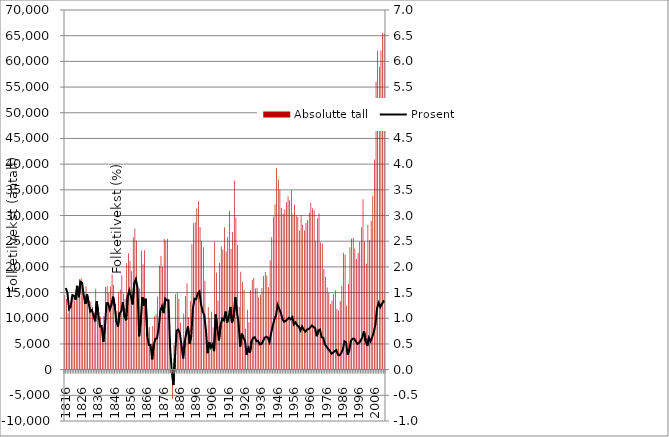
| Category | Absolutte tall |
|---|---|
| 1816 | 14492 |
| 1817 | 13813 |
| 1818 | 11086 |
| 1819 | 11678 |
| 1820 | 13969 |
| 1821 | 14039 |
| 1822 | 13448 |
| 1823 | 16417 |
| 1824 | 14407 |
| 1825 | 17655 |
| 1826 | 17784 |
| 1827 | 15534 |
| 1828 | 13937 |
| 1829 | 16211 |
| 1830 | 14534 |
| 1831 | 12834 |
| 1832 | 13257 |
| 1833 | 12173 |
| 1834 | 10995 |
| 1835 | 15741 |
| 1836 | 12808 |
| 1837 | 10199 |
| 1838 | 10312 |
| 1839 | 6605 |
| 1840 | 10431 |
| 1841 | 16099 |
| 1842 | 16285 |
| 1843 | 14907 |
| 1844 | 16252 |
| 1845 | 18573 |
| 1846 | 16513 |
| 1847 | 12694 |
| 1848 | 11411 |
| 1849 | 15060 |
| 1850 | 15584 |
| 1851 | 18340 |
| 1852 | 14797 |
| 1853 | 13771 |
| 1854 | 20757 |
| 1855 | 22649 |
| 1856 | 21128 |
| 1857 | 19137 |
| 1858 | 25764 |
| 1859 | 27449 |
| 1860 | 25128 |
| 1861 | 10449 |
| 1862 | 15767 |
| 1863 | 23128 |
| 1864 | 20513 |
| 1865 | 23246 |
| 1866 | 11031 |
| 1867 | 8146 |
| 1868 | 8309 |
| 1869 | 3413 |
| 1870 | 8507 |
| 1871 | 10382 |
| 1872 | 10769 |
| 1873 | 14215 |
| 1874 | 20224 |
| 1875 | 22101 |
| 1876 | 20005 |
| 1877 | 25427 |
| 1878 | 25100 |
| 1879 | 25482 |
| 1880 | 8416 |
| 1881 | -670 |
| 1882 | -5692 |
| 1883 | 4791 |
| 1884 | 14692 |
| 1885 | 15025 |
| 1886 | 13788 |
| 1887 | 9179 |
| 1888 | 4438 |
| 1889 | 10922 |
| 1890 | 14346 |
| 1891 | 16803 |
| 1892 | 10222 |
| 1893 | 13339 |
| 1894 | 24382 |
| 1895 | 28480 |
| 1896 | 28696 |
| 1897 | 31394 |
| 1898 | 32778 |
| 1899 | 27775 |
| 1900 | 25024 |
| 1901 | 23832 |
| 1902 | 17316 |
| 1903 | 7249 |
| 1904 | 12203 |
| 1905 | 9954 |
| 1906 | 11283 |
| 1907 | 8260 |
| 1908 | 24944 |
| 1909 | 18916 |
| 1910 | 13450 |
| 1911 | 20788 |
| 1912 | 23988 |
| 1913 | 23391 |
| 1914 | 27700 |
| 1915 | 22994 |
| 1916 | 25829 |
| 1917 | 30902 |
| 1918 | 23469 |
| 1919 | 26811 |
| 1920 | 36780 |
| 1921 | 29626 |
| 1922 | 24320 |
| 1923 | 12233 |
| 1924 | 19065 |
| 1925 | 17033 |
| 1926 | 15549 |
| 1927 | 7971 |
| 1928 | 11646 |
| 1929 | 9216 |
| 1930 | 15451 |
| 1931 | 17435 |
| 1932 | 17858 |
| 1933 | 15772 |
| 1934 | 15953 |
| 1935 | 14057 |
| 1936 | 14559 |
| 1937 | 15888 |
| 1938 | 18234 |
| 1939 | 18989 |
| 1940 | 18315 |
| 1941 | 16020 |
| 1942 | 21277 |
| 1943 | 25816 |
| 1944 | 29747 |
| 1945 | 32185 |
| 1946 | 39228 |
| 1947 | 37028 |
| 1948 | 34974 |
| 1949 | 31455 |
| 1950 | 30342 |
| 1951 | 31150 |
| 1952 | 32564 |
| 1953 | 33756 |
| 1954 | 32960 |
| 1955 | 34947 |
| 1956 | 30217 |
| 1957 | 32096 |
| 1958 | 30015 |
| 1959 | 29706 |
| 1960 | 27064 |
| 1961 | 30058 |
| 1962 | 28177 |
| 1963 | 27062 |
| 1964 | 28541 |
| 1965 | 29117 |
| 1966 | 30572 |
| 1967 | 32482 |
| 1968 | 31412 |
| 1969 | 31029 |
| 1970 | 25084 |
| 1971 | 29468 |
| 1972 | 30462 |
| 1973 | 24755 |
| 1974 | 24535 |
| 1975 | 19576 |
| 1976 | 18101 |
| 1977 | 16006 |
| 1978 | 14926 |
| 1979 | 12766 |
| 1980 | 13440 |
| 1981 | 14723 |
| 1982 | 15448 |
| 1983 | 11842 |
| 1984 | 11492 |
| 1985 | 13342 |
| 1986 | 16334 |
| 1987 | 22768 |
| 1988 | 22397 |
| 1989 | 12430 |
| 1990 | 16714 |
| 1991 | 23804 |
| 1992 | 25533 |
| 1993 | 25648 |
| 1994 | 23595 |
| 1995 | 21547 |
| 1996 | 22757 |
| 1997 | 24885 |
| 1998 | 27730 |
| 1999 | 33168 |
| 2000 | 24939 |
| 2001 | 20630 |
| 2002 | 28186 |
| 2003 | 25205 |
| 2004 | 28906 |
| 2005 | 33856 |
| 2006 | 40915 |
| 2007 | 56037 |
| 2008 | 62081 |
| 2009 | 58947 |
| 2010 | 62106 |
| 2011 | 65565 |
| 2012 | 65405 |